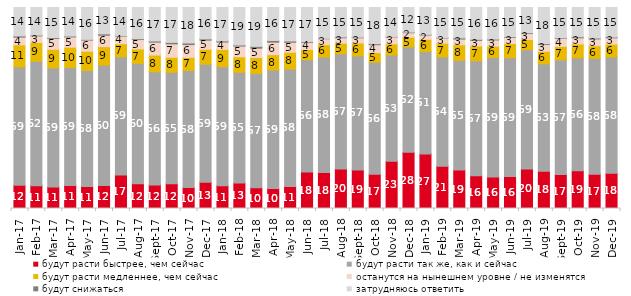
| Category | будут расти быстрее, чем сейчас | будут расти так же, как и сейчас | будут расти медленнее, чем сейчас | останутся на нынешнем уровне / не изменятся | будут снижаться | затрудняюсь ответить |
|---|---|---|---|---|---|---|
| 2017-01-01 | 11.6 | 58.85 | 10.95 | 3.85 | 0.6 | 14.15 |
| 2017-02-01 | 11.35 | 61.95 | 9.3 | 3.3 | 0.35 | 13.75 |
| 2017-03-01 | 10.7 | 59.25 | 9.25 | 5.35 | 0.45 | 15 |
| 2017-04-01 | 11.45 | 58.75 | 10.05 | 5.1 | 0.45 | 14.2 |
| 2017-05-01 | 11 | 57.65 | 9.6 | 5.55 | 0.35 | 15.85 |
| 2017-06-01 | 11.5 | 59.85 | 9.2 | 5.65 | 0.7 | 13.1 |
| 2017-07-01 | 16.7 | 58.8 | 6.5 | 3.75 | 0.25 | 14 |
| 2017-08-01 | 12.35 | 59.85 | 7.2 | 4.65 | 0.45 | 15.5 |
| 2017-09-01 | 11.75 | 56.25 | 8.35 | 6.4 | 0.6 | 16.65 |
| 2017-10-01 | 12.3 | 55.45 | 7.5 | 6.65 | 0.75 | 17.35 |
| 2017-11-01 | 10.4 | 58.25 | 6.55 | 6.35 | 0.8 | 17.65 |
| 2017-12-01 | 13.1 | 58.7 | 7.4 | 4.55 | 0.65 | 15.6 |
| 2018-01-01 | 11.35 | 59.2 | 8.6 | 3.65 | 0.6 | 16.6 |
| 2018-02-01 | 12.7 | 55.05 | 7.75 | 5.3 | 0.55 | 18.65 |
| 2018-03-01 | 10.3 | 56.85 | 8 | 4.6 | 0.9 | 19.35 |
| 2018-04-01 | 9.9 | 59 | 7.65 | 6.2 | 0.85 | 16.4 |
| 2018-05-01 | 10.95 | 58.4 | 8.4 | 4.95 | 0.65 | 16.65 |
| 2018-06-01 | 18.15 | 55.9 | 5.05 | 3.6 | 0.4 | 16.9 |
| 2018-07-01 | 17.85 | 57.5 | 6.15 | 2.95 | 0.2 | 15.35 |
| 2018-08-01 | 19.65 | 57.35 | 5.25 | 2.7 | 0.4 | 14.65 |
| 2018-09-01 | 19.1 | 56.85 | 6.4 | 2.6 | 0.3 | 14.75 |
| 2018-10-01 | 17.1 | 55.65 | 4.8 | 3.95 | 0.5 | 18 |
| 2018-11-01 | 23.453 | 52.894 | 5.539 | 3.443 | 0.2 | 14.471 |
| 2018-12-01 | 27.95 | 52.45 | 4.8 | 2.25 | 0.3 | 12.25 |
| 2019-01-01 | 27.15 | 50.9 | 6.1 | 2.15 | 0.3 | 13.4 |
| 2019-02-01 | 21.05 | 54.35 | 6.85 | 2.55 | 0.2 | 15 |
| 2019-03-01 | 19.095 | 54.649 | 7.708 | 2.834 | 0.597 | 15.117 |
| 2019-04-01 | 16.287 | 57.178 | 7.376 | 2.822 | 0.495 | 15.842 |
| 2019-05-01 | 15.701 | 59.435 | 5.646 | 3.071 | 0.446 | 15.701 |
| 2019-06-01 | 15.86 | 59.202 | 6.983 | 3.092 | 0.349 | 14.514 |
| 2019-07-01 | 19.604 | 59.406 | 5.099 | 2.921 | 0.396 | 12.574 |
| 2019-08-01 | 18.482 | 53.497 | 6.194 | 3.447 | 0.45 | 17.932 |
| 2019-09-01 | 16.881 | 57.079 | 6.683 | 4.01 | 0.297 | 15.05 |
| 2019-10-01 | 18.762 | 56.238 | 6.832 | 3.069 | 0.545 | 14.554 |
| 2019-11-01 | 17.03 | 57.673 | 6.238 | 3.416 | 0.446 | 15.198 |
| 2019-12-01 | 17.574 | 57.822 | 6.386 | 3.119 | 0.396 | 14.703 |